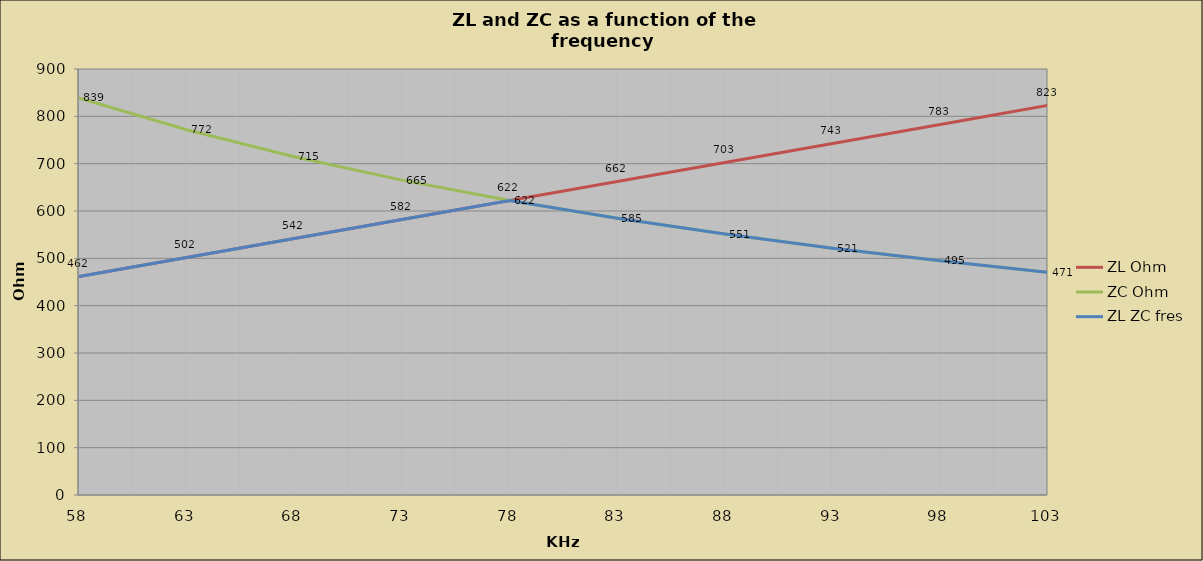
| Category | ZL Ohm | ZC Ohm | ZL ZC fres |
|---|---|---|---|
| 57.5 | 461.711 | 838.761 | 461.711 |
| 62.5 | 501.86 | 771.66 | 501.86 |
| 67.5 | 542.009 | 714.5 | 542.009 |
| 72.5 | 582.158 | 665.224 | 582.158 |
| 77.5 | 622.307 | 622.307 | 622.307 |
| 82.5 | 662.455 | 584.591 | 584.591 |
| 87.5 | 702.604 | 551.186 | 551.186 |
| 92.5 | 742.753 | 521.392 | 521.392 |
| 97.5 | 782.902 | 494.654 | 494.654 |
| 102.5 | 823.051 | 470.525 | 470.525 |